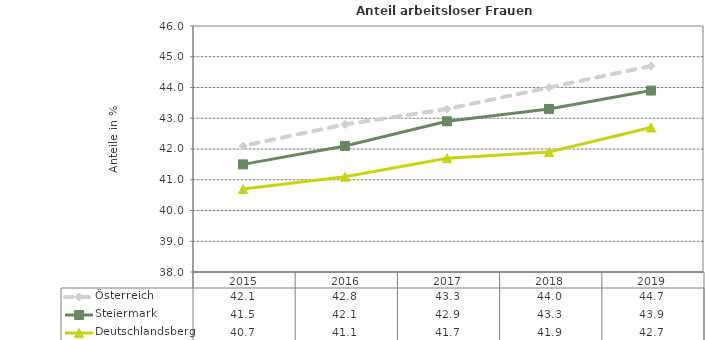
| Category | Österreich | Steiermark | Deutschlandsberg |
|---|---|---|---|
| 2019.0 | 44.7 | 43.9 | 42.7 |
| 2018.0 | 44 | 43.3 | 41.9 |
| 2017.0 | 43.3 | 42.9 | 41.7 |
| 2016.0 | 42.8 | 42.1 | 41.1 |
| 2015.0 | 42.1 | 41.5 | 40.7 |